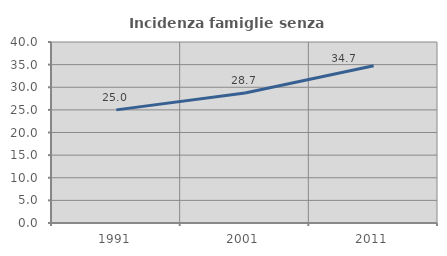
| Category | Incidenza famiglie senza nuclei |
|---|---|
| 1991.0 | 25 |
| 2001.0 | 28.721 |
| 2011.0 | 34.744 |